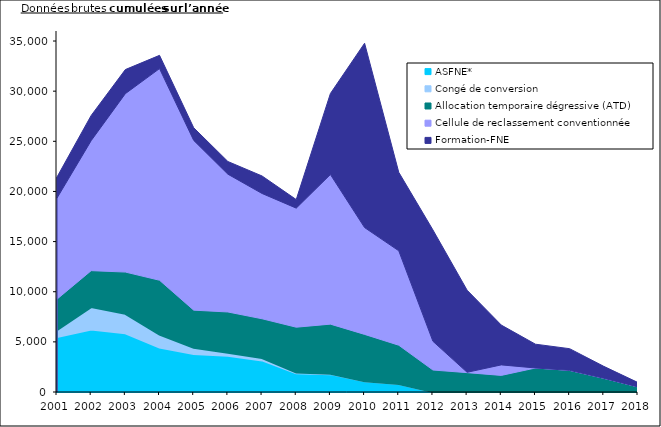
| Category | ASFNE* | Congé de conversion | Allocation temporaire dégressive (ATD) | Cellule de reclassement conventionnée | Formation-FNE |
|---|---|---|---|---|---|
| 2001.0 | 5474 | 692 | 3095 | 10076 | 2098 |
| 2002.0 | 6226 | 2245 | 3630 | 12966 | 2509 |
| 2003.0 | 5863 | 1929 | 4169 | 17790 | 2402 |
| 2004.0 | 4428 | 1303 | 5414 | 21105 | 1322 |
| 2005.0 | 3784 | 614 | 3765 | 16927 | 1259 |
| 2006.0 | 3619 | 303 | 4058 | 13742 | 1263 |
| 2007.0 | 3149 | 228 | 3927 | 12492 | 1747 |
| 2008.0 | 1862 | 92 | 4508 | 11874 | 852 |
| 2009.0 | 1781 | 43 | 4944 | 14920 | 8078 |
| 2010.0 | 1070 | 0 | 4675 | 10653 | 18382 |
| 2011.0 | 797 | 0 | 3869 | 9416 | 7829 |
| 2012.0 | 0 | 0 | 2191 | 2865 | 11102 |
| 2013.0 | 0 | 0 | 1932 | 33 | 8187 |
| 2014.0 | 0 | 0 | 1656 | 1048 | 3969 |
| 2015.0 | 0 | 0 | 2395 | 0 | 2372 |
| 2016.0 | 0 | 0 | 2158 | 0 | 2160 |
| 2017.0 | 0 | 0 | 1371 | 0 | 1185 |
| 2018.0 | 0 | 0 | 505 | 0 | 436 |